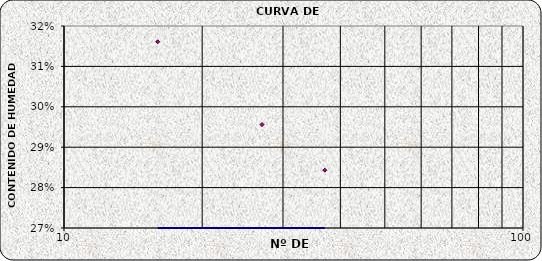
| Category | Series 0 |
|---|---|
| 37.0 | 0.284 |
| 27.0 | 0.296 |
| 16.0 | 0.316 |